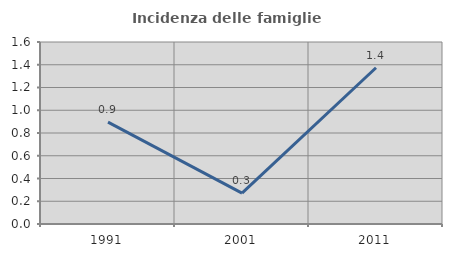
| Category | Incidenza delle famiglie numerose |
|---|---|
| 1991.0 | 0.896 |
| 2001.0 | 0.272 |
| 2011.0 | 1.374 |